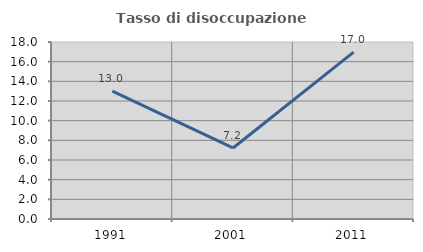
| Category | Tasso di disoccupazione giovanile  |
|---|---|
| 1991.0 | 13.008 |
| 2001.0 | 7.222 |
| 2011.0 | 16.975 |